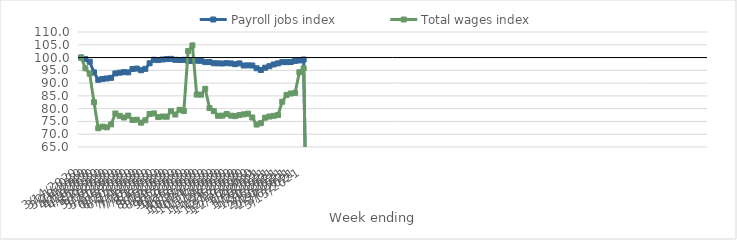
| Category | Payroll jobs index | Total wages index |
|---|---|---|
| 14/03/2020 | 100 | 100 |
| 21/03/2020 | 99.372 | 95.786 |
| 28/03/2020 | 98.347 | 93.704 |
| 04/04/2020 | 94.192 | 82.517 |
| 11/04/2020 | 91.302 | 72.339 |
| 18/04/2020 | 91.622 | 72.964 |
| 25/04/2020 | 91.813 | 72.692 |
| 02/05/2020 | 92.059 | 73.847 |
| 09/05/2020 | 93.791 | 78.112 |
| 16/05/2020 | 94.085 | 77.203 |
| 23/05/2020 | 94.284 | 76.534 |
| 30/05/2020 | 94.209 | 77.284 |
| 06/06/2020 | 95.518 | 75.56 |
| 13/06/2020 | 95.684 | 75.68 |
| 20/06/2020 | 95.032 | 74.525 |
| 27/06/2020 | 95.563 | 75.435 |
| 04/07/2020 | 97.766 | 77.923 |
| 11/07/2020 | 99.133 | 78.128 |
| 18/07/2020 | 99.016 | 76.727 |
| 25/07/2020 | 99.228 | 76.928 |
| 01/08/2020 | 99.399 | 76.854 |
| 08/08/2020 | 99.482 | 79.007 |
| 15/08/2020 | 99.118 | 77.709 |
| 22/08/2020 | 99.058 | 79.548 |
| 29/08/2020 | 99.113 | 79.071 |
| 05/09/2020 | 98.695 | 102.524 |
| 12/09/2020 | 98.691 | 104.736 |
| 19/09/2020 | 98.767 | 85.527 |
| 26/09/2020 | 98.718 | 85.473 |
| 03/10/2020 | 98.213 | 87.747 |
| 10/10/2020 | 98.262 | 80.231 |
| 17/10/2020 | 97.768 | 79.044 |
| 24/10/2020 | 97.731 | 77.208 |
| 31/10/2020 | 97.676 | 77.255 |
| 07/11/2020 | 97.809 | 77.917 |
| 14/11/2020 | 97.704 | 77.272 |
| 21/11/2020 | 97.408 | 77.08 |
| 28/11/2020 | 97.726 | 77.491 |
| 05/12/2020 | 96.903 | 77.772 |
| 12/12/2020 | 96.943 | 78.045 |
| 19/12/2020 | 96.9 | 76.544 |
| 26/12/2020 | 95.812 | 73.782 |
| 02/01/2021 | 95.131 | 74.319 |
| 09/01/2021 | 96.029 | 76.474 |
| 16/01/2021 | 96.619 | 76.923 |
| 23/01/2021 | 97.305 | 77.198 |
| 30/01/2021 | 97.729 | 77.491 |
| 06/02/2021 | 98.204 | 82.71 |
| 13/02/2021 | 98.207 | 85.38 |
| 20/02/2021 | 98.279 | 85.926 |
| 27/02/2021 | 98.688 | 86.178 |
| 06/03/2021 | 98.863 | 94.269 |
| 13/03/2021 | 99.234 | 95.772 |